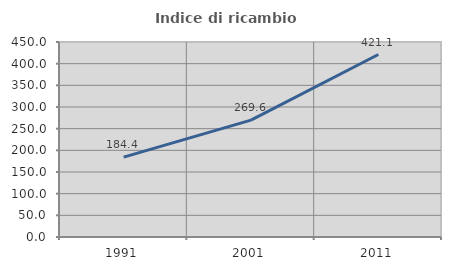
| Category | Indice di ricambio occupazionale  |
|---|---|
| 1991.0 | 184.437 |
| 2001.0 | 269.634 |
| 2011.0 | 421.118 |